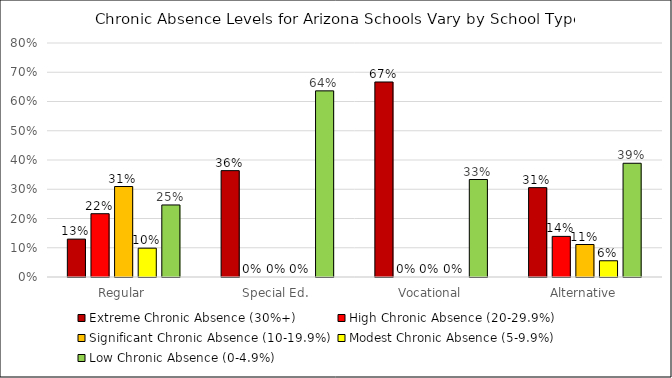
| Category | Extreme Chronic Absence (30%+) | High Chronic Absence (20-29.9%) | Significant Chronic Absence (10-19.9%) | Modest Chronic Absence (5-9.9%) | Low Chronic Absence (0-4.9%) |
|---|---|---|---|---|---|
| Regular | 0.129 | 0.216 | 0.309 | 0.099 | 0.246 |
| Special Ed. | 0.364 | 0 | 0 | 0 | 0.636 |
| Vocational | 0.667 | 0 | 0 | 0 | 0.333 |
| Alternative | 0.306 | 0.139 | 0.111 | 0.056 | 0.389 |